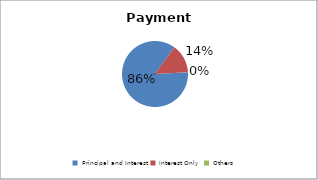
| Category | Series 0 |
|---|---|
| Principal and Interest | 0.858 |
| Interest Only | 0.141 |
| Others | 0 |